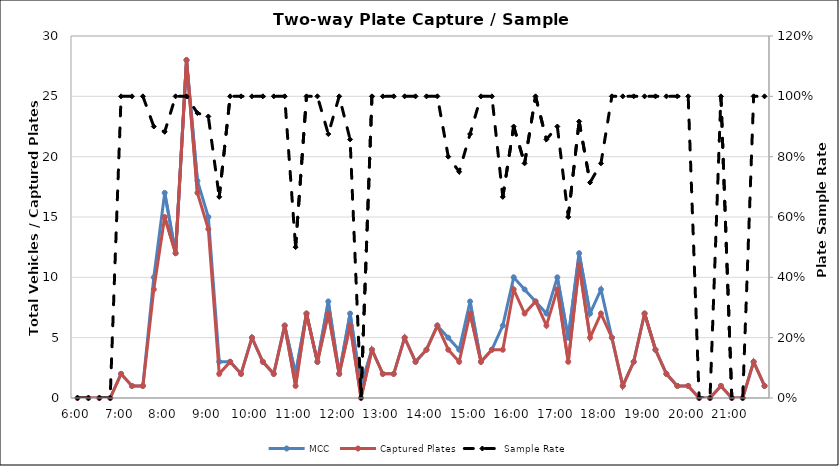
| Category | MCC | Captured Plates |
|---|---|---|
| 0.25 | 0 | 0 |
| 0.260416666666667 | 0 | 0 |
| 0.270833333333333 | 0 | 0 |
| 0.28125 | 0 | 0 |
| 0.291666666666667 | 2 | 2 |
| 0.302083333333333 | 1 | 1 |
| 0.3125 | 1 | 1 |
| 0.322916666666667 | 10 | 9 |
| 0.333333333333333 | 17 | 15 |
| 0.34375 | 12 | 12 |
| 0.354166666666667 | 28 | 28 |
| 0.364583333333333 | 18 | 17 |
| 0.375 | 15 | 14 |
| 0.385416666666667 | 3 | 2 |
| 0.395833333333333 | 3 | 3 |
| 0.40625 | 2 | 2 |
| 0.416666666666667 | 5 | 5 |
| 0.427083333333333 | 3 | 3 |
| 0.4375 | 2 | 2 |
| 0.447916666666667 | 6 | 6 |
| 0.458333333333333 | 2 | 1 |
| 0.46875 | 7 | 7 |
| 0.479166666666667 | 3 | 3 |
| 0.489583333333333 | 8 | 7 |
| 0.5 | 2 | 2 |
| 0.510416666666667 | 7 | 6 |
| 0.520833333333333 | 1 | 0 |
| 0.53125 | 4 | 4 |
| 0.541666666666667 | 2 | 2 |
| 0.552083333333333 | 2 | 2 |
| 0.5625 | 5 | 5 |
| 0.572916666666667 | 3 | 3 |
| 0.583333333333333 | 4 | 4 |
| 0.59375 | 6 | 6 |
| 0.604166666666667 | 5 | 4 |
| 0.614583333333333 | 4 | 3 |
| 0.625 | 8 | 7 |
| 0.635416666666667 | 3 | 3 |
| 0.645833333333333 | 4 | 4 |
| 0.65625 | 6 | 4 |
| 0.666666666666667 | 10 | 9 |
| 0.677083333333333 | 9 | 7 |
| 0.6875 | 8 | 8 |
| 0.697916666666667 | 7 | 6 |
| 0.708333333333333 | 10 | 9 |
| 0.71875 | 5 | 3 |
| 0.729166666666667 | 12 | 11 |
| 0.739583333333333 | 7 | 5 |
| 0.75 | 9 | 7 |
| 0.760416666666667 | 5 | 5 |
| 0.770833333333333 | 1 | 1 |
| 0.78125 | 3 | 3 |
| 0.791666666666667 | 7 | 7 |
| 0.802083333333333 | 4 | 4 |
| 0.8125 | 2 | 2 |
| 0.822916666666667 | 1 | 1 |
| 0.833333333333333 | 1 | 1 |
| 0.84375 | 0 | 0 |
| 0.854166666666667 | 0 | 0 |
| 0.864583333333333 | 1 | 1 |
| 0.875 | 0 | 0 |
| 0.885416666666667 | 0 | 0 |
| 0.895833333333333 | 3 | 3 |
| 0.90625 | 1 | 1 |